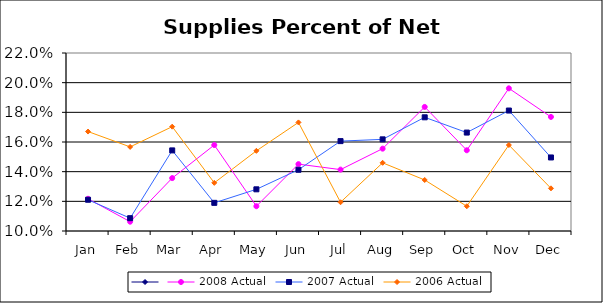
| Category | Series 0 | 2008 Actual | 2007 Actual | 2006 Actual |
|---|---|---|---|---|
| Jan |  | 0.122 | 0.121 | 0.167 |
| Feb |  | 0.106 | 0.109 | 0.157 |
| Mar |  | 0.136 | 0.154 | 0.17 |
| Apr |  | 0.158 | 0.119 | 0.132 |
| May |  | 0.117 | 0.128 | 0.154 |
| Jun |  | 0.145 | 0.141 | 0.173 |
| Jul |  | 0.141 | 0.161 | 0.119 |
| Aug |  | 0.156 | 0.162 | 0.146 |
| Sep |  | 0.184 | 0.177 | 0.134 |
| Oct |  | 0.154 | 0.166 | 0.117 |
| Nov |  | 0.196 | 0.181 | 0.158 |
| Dec |  | 0.177 | 0.15 | 0.129 |